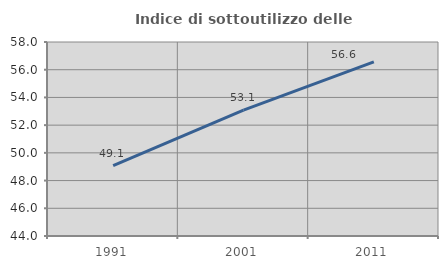
| Category | Indice di sottoutilizzo delle abitazioni  |
|---|---|
| 1991.0 | 49.082 |
| 2001.0 | 53.081 |
| 2011.0 | 56.566 |